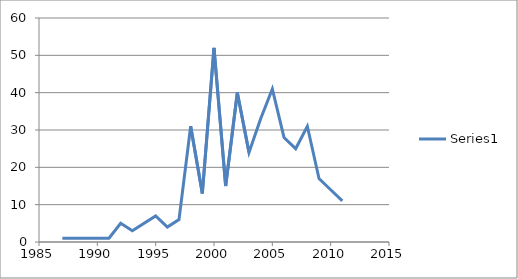
| Category | Series 0 |
|---|---|
| 1987.0 | 1 |
| 1991.0 | 1 |
| 1992.0 | 5 |
| 1993.0 | 3 |
| 1995.0 | 7 |
| 1996.0 | 4 |
| 1997.0 | 6 |
| 1998.0 | 31 |
| 1999.0 | 13 |
| 2000.0 | 52 |
| 2001.0 | 15 |
| 2002.0 | 40 |
| 2003.0 | 24 |
| 2004.0 | 33 |
| 2005.0 | 41 |
| 2006.0 | 28 |
| 2007.0 | 25 |
| 2008.0 | 31 |
| 2009.0 | 17 |
| 2010.0 | 14 |
| 2011.0 | 11 |